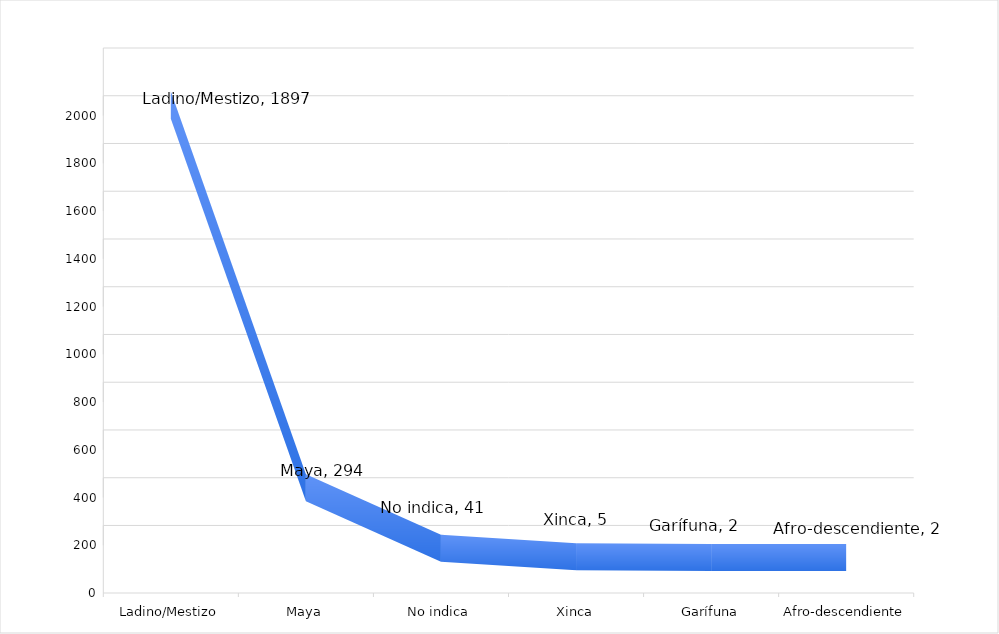
| Category | Series 0 |
|---|---|
| Ladino/Mestizo | 1897 |
| Maya | 294 |
| No indica | 41 |
| Xinca | 5 |
| Garífuna | 2 |
| Afro-descendiente | 2 |